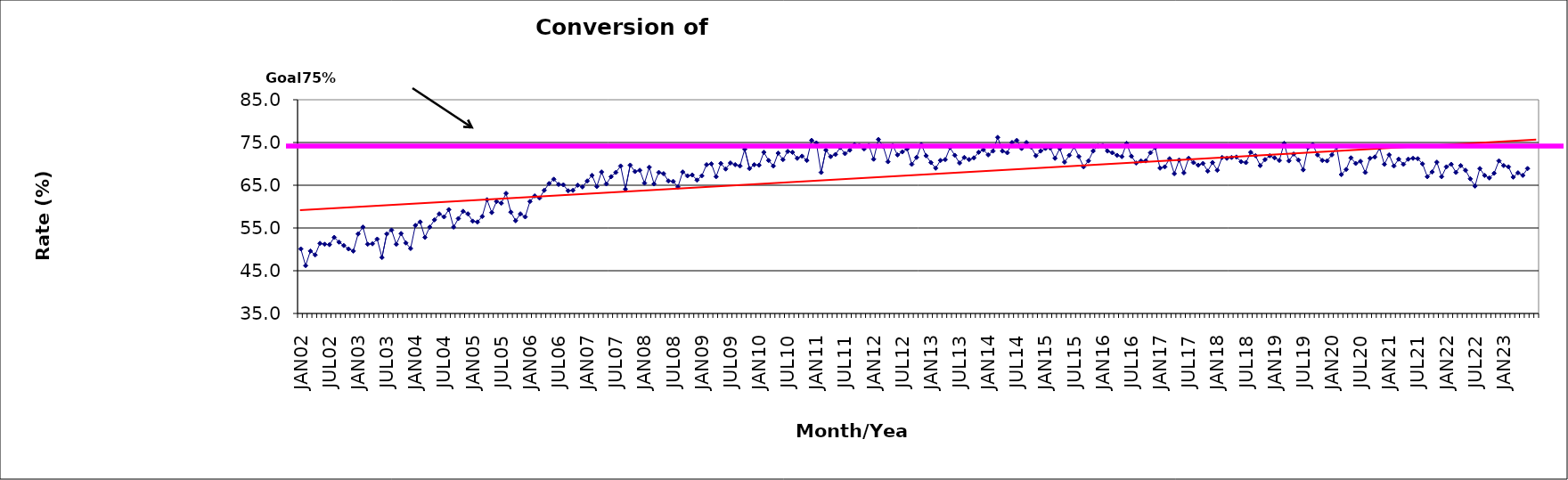
| Category | Series 0 |
|---|---|
| JAN02 | 50.1 |
| FEB02 | 46.2 |
| MAR02 | 49.6 |
| APR02 | 48.7 |
| MAY02 | 51.4 |
| JUN02 | 51.2 |
| JUL02 | 51.1 |
| AUG02 | 52.8 |
| SEP02 | 51.7 |
| OCT02 | 50.9 |
| NOV02 | 50.1 |
| DEC02 | 49.6 |
| JAN03 | 53.6 |
| FEB03 | 55.2 |
| MAR03 | 51.2 |
| APR03 | 51.3 |
| MAY03 | 52.4 |
| JUN03 | 48.1 |
| JUL03 | 53.6 |
| AUG03 | 54.5 |
| SEP03 | 51.2 |
| OCT03 | 53.7 |
| NOV03 | 51.5 |
| DEC03 | 50.2 |
| JAN04 | 55.6 |
| FEB04 | 56.4 |
| MAR04 | 52.8 |
| APR04 | 55.2 |
| MAY04 | 56.9 |
| JUN04 | 58.3 |
| JUL04 | 57.6 |
| AUG04 | 59.3 |
| SEP04 | 55.2 |
| OCT04 | 57.2 |
| NOV04 | 58.9 |
| DEC04 | 58.3 |
| JAN05 | 56.6 |
| FEB05 | 56.4 |
| MAR05 | 57.7 |
| APR05 | 61.6 |
| MAY05 | 58.6 |
| JUN05 | 61.2 |
| JUL05 | 60.8 |
| AUG05 | 63.1 |
| SEP05 | 58.7 |
| OCT05 | 56.7 |
| NOV05 | 58.3 |
| DEC05 | 57.6 |
| JAN06 | 61.2 |
| FEB06 | 62.5 |
| MAR06 | 62 |
| APR06 | 63.8 |
| MAY06 | 65.4 |
| JUN06 | 66.4 |
| JUL06 | 65.2 |
| AUG06 | 65.1 |
| SEP06 | 63.7 |
| OCT06 | 63.8 |
| NOV06 | 65 |
| DEC06 | 64.6 |
| JAN07 | 66 |
| FEB07 | 67.3 |
| MAR07 | 64.7 |
| APR07 | 68.1 |
| MAY07 | 65.3 |
| JUN07 | 67 |
| JUL07 | 68 |
| AUG07 | 69.5 |
| SEP07 | 64.1 |
| OCT07 | 69.7 |
| NOV07 | 68.2 |
| DEC07 | 68.5 |
| JAN08 | 65.5 |
| FEB08 | 69.2 |
| MAR08 | 65.3 |
| APR08 | 68 |
| MAY08 | 67.7 |
| JUN08 | 66 |
| JUL08 | 65.9 |
| AUG08 | 64.6 |
| SEP08 | 68.1 |
| OCT08 | 67.2 |
| NOV08 | 67.4 |
| DEC08 | 66.2 |
| JAN09 | 67.2 |
| FEB09 | 69.8 |
| MAR09 | 70 |
| APR09 | 67 |
| MAY09 | 70.1 |
| JUN09 | 68.8 |
| JUL09 | 70.2 |
| AUG09 | 69.8 |
| SEP09 | 69.5 |
| OCT09 | 73.4 |
| NOV09 | 68.9 |
| DEC09 | 69.8 |
| JAN10 | 69.7 |
| FEB10 | 72.7 |
| MAR10 | 70.8 |
| APR10 | 69.5 |
| MAY10 | 72.5 |
| JUN10 | 71 |
| JUL10 | 72.9 |
| AUG10 | 72.7 |
| SEP10 | 71.3 |
| OCT10 | 71.8 |
| NOV10 | 70.8 |
| DEC10 | 75.5 |
| JAN11 | 74.9 |
| FEB11 | 68 |
| MAR11 | 73.2 |
| APR11 | 71.7 |
| MAY11 | 72.2 |
| JUN11 | 73.8 |
| JUL11 | 72.4 |
| AUG11 | 73.2 |
| SEP11 | 74.5 |
| OCT11 | 74.3 |
| NOV11 | 73.5 |
| DEC11 | 74.3 |
| JAN12 | 71.1 |
| FEB12 | 75.7 |
| MAR12 | 74.1 |
| APR12 | 70.5 |
| MAY12 | 74.3 |
| JUN12 | 72.1 |
| JUL12 | 72.8 |
| AUG12 | 73.5 |
| SEP12 | 69.9 |
| OCT12 | 71.5 |
| NOV12 | 74.5 |
| DEC12 | 71.9 |
| JAN13 | 70.3 |
| FEB13 | 69 |
| MAR13 | 70.8 |
| APR13 | 71 |
| MAY13 | 73.8 |
| JUN13 | 72 |
| JUL13 | 70.2 |
| AUG13 | 71.5 |
| SEP13 | 71 |
| OCT13 | 71.4 |
| NOV13 | 72.7 |
| DEC13 | 73.3 |
| JAN14 | 72.1 |
| FEB14 | 73 |
| MAR14 | 76.2 |
| APR14 | 73 |
| MAY14 | 72.6 |
| JUN14 | 75 |
| JUL14 | 75.5 |
| AUG14 | 73.6 |
| SEP14 | 75 |
| OCT14 | 73.9 |
| NOV14 | 71.9 |
| DEC14 | 73 |
| JAN15 | 73.6 |
| FEB15 | 73.7 |
| MAR15 | 71.3 |
| APR15 | 73.6 |
| MAY15 | 70.4 |
| JUN15 | 72 |
| JUL15 | 74 |
| AUG15 | 71.7 |
| SEP15 | 69.3 |
| OCT15 | 70.7 |
| NOV15 | 73 |
| DEC15 | 74.2 |
| JAN16 | 74.3 |
| FEB16 | 73 |
| MAR16 | 72.6 |
| APR16 | 72 |
| MAY16 | 71.7 |
| JUN16 | 74.8 |
| JUL16 | 71.8 |
| AUG16 | 70.2 |
| SEP16 | 70.7 |
| OCT16 | 70.7 |
| NOV16 | 72.6 |
| DEC16 | 73.8 |
| JAN17 | 69 |
| FEB17 | 69.3 |
| MAR17 | 71.2 |
| APR17 | 67.7 |
| MAY17 | 70.9 |
| JUN17 | 67.9 |
| JUL17 | 71.3 |
| AUG17 | 70.3 |
| SEP17 | 69.7 |
| OCT17 | 70.1 |
| NOV17 | 68.3 |
| DEC17 | 70.3 |
| JAN18 | 68.5 |
| FEB18 | 71.5 |
| MAR18 | 71.3 |
| APR18 | 71.5 |
| MAY18 | 71.6 |
| JUN18 | 70.5 |
| JUL18 | 70.3 |
| AUG18 | 72.7 |
| SEP18 | 71.9 |
| OCT18 | 69.6 |
| NOV18 | 71 |
| DEC18 | 71.9 |
| JAN19 | 71.4 |
| FEB19 | 70.8 |
| MAR19 | 74.8 |
| APR19 | 70.7 |
| MAY19 | 72.3 |
| JUN19 | 70.9 |
| JUL19 | 68.6 |
| AUG19 | 73.8 |
| SEP19 | 74.5 |
| OCT19 | 72.1 |
| NOV19 | 70.8 |
| DEC19 | 70.7 |
| JAN20 | 72.1 |
| FEB20 | 73.9 |
| MAR20 | 67.5 |
| APR20 | 68.7 |
| MAY20 | 71.4 |
| JUN20 | 70.1 |
| JUL20 | 70.6 |
| AUG20 | 68 |
| SEP20 | 71.3 |
| OCT20 | 71.6 |
| NOV20 | 73.7 |
| DEC20 | 69.9 |
| JAN21 | 72.1 |
| FEB21 | 69.5 |
| MAR21 | 71.1 |
| APR21 | 69.9 |
| MAY21 | 71.1 |
| JUN21 | 71.3 |
| JUL21 | 71.2 |
| AUG21 | 70 |
| SEP21 | 67 |
| OCT21 | 68.1 |
| NOV21 | 70.4 |
| DEC21 | 67 |
| JAN22 | 69.3 |
| FEB22 | 69.9 |
| MAR22 | 68 |
| APR22 | 69.6 |
| MAY22 | 68.5 |
| JUN22 | 66.5 |
| JUL22 | 64.8 |
| AUG22 | 68.9 |
| SEP22 | 67.3 |
| OCT22 | 66.7 |
| NOV22 | 67.8 |
| DEC22 | 70.7 |
| JAN23 | 69.6 |
| FEB23 | 69.3 |
| MAR23 | 66.9 |
| APR23 | 67.9 |
| MAY23 | 67.3 |
| JUN23 | 68.9 |